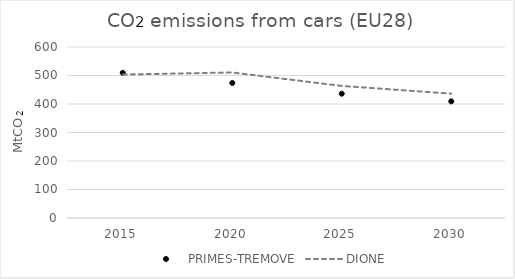
| Category | PRIMES-TREMOVE | DIONE |
|---|---|---|
| 2015.0 | 509286.067 | 503308.042 |
| 2020.0 | 473778.757 | 510635.713 |
| 2025.0 | 436144.966 | 463446.868 |
| 2030.0 | 409303.899 | 436304.077 |